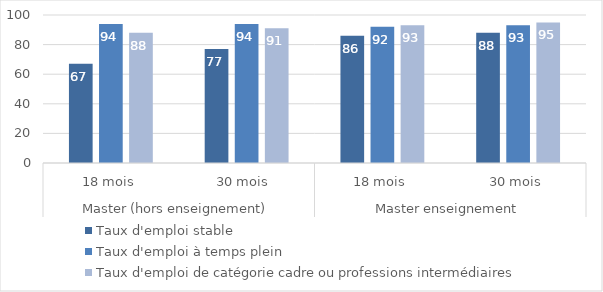
| Category | Taux d'emploi stable | Taux d'emploi à temps plein | Taux d'emploi de catégorie cadre ou professions intermédiaires |
|---|---|---|---|
| 0 | 67 | 94 | 88 |
| 1 | 77 | 94 | 91 |
| 2 | 86 | 92 | 93 |
| 3 | 88 | 93 | 95 |